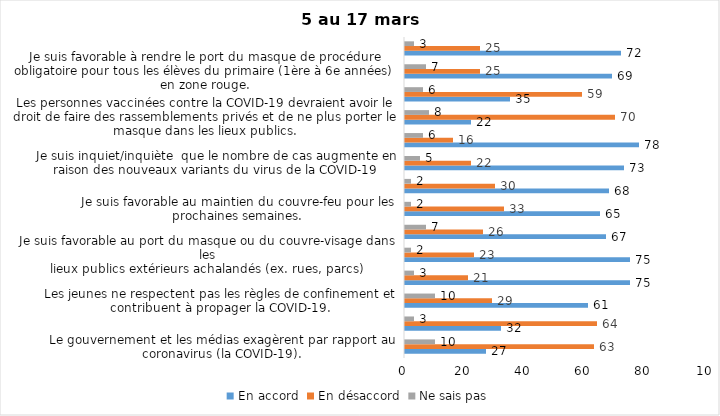
| Category | En accord | En désaccord | Ne sais pas |
|---|---|---|---|
| Le gouvernement et les médias exagèrent par rapport au coronavirus (la COVID-19). | 27 | 63 | 10 |
| Il est exagéré de rester chez soi pour se protéger contre le coronavirus (la COVID-19). | 32 | 64 | 3 |
| Les jeunes ne respectent pas les règles de confinement et contribuent à propager la COVID-19. | 61 | 29 | 10 |
| C’est une bonne chose que les policiers puissent donner facilement des contraventions aux gens qui ne respectent pas les mesures pour prévenir le coronavirus (la COVID-19). | 75 | 21 | 3 |
| Je suis favorable au port du masque ou du couvre-visage dans les
lieux publics extérieurs achalandés (ex. rues, parcs) | 75 | 23 | 2 |
| Les activités extérieures en petits groupes sont sécuritaires pour éviter la propagation de la COVID-19. | 67 | 26 | 7 |
| Je suis favorable au maintien du couvre-feu pour les prochaines semaines. | 65 | 33 | 2 |
| J’ai peur que le système de santé soit débordé par les cas de COVID-19 suite à l’assouplissement des mesures | 68 | 30 | 2 |
| Je suis inquiet/inquiète  que le nombre de cas augmente en raison des nouveaux variants du virus de la COVID-19 | 73 | 22 | 5 |
| La frontière entre le Canada et les États-Unis devrait être fermée au moins jusqu’en septembre 2021 | 78 | 16 | 6 |
| Les personnes vaccinées contre la COVID-19 devraient avoir le droit de faire des rassemblements privés et de ne plus porter le masque dans les lieux publics. | 22 | 70 | 8 |
| Je crois que le gouvernement a implanté trop de mesures par rapport à ce que la santé publique recommandait (ex. : fermeture des restaurants). | 35 | 59 | 6 |
| Je suis favorable à rendre le port du masque de procédure obligatoire pour tous les élèves du primaire (1ère à 6e années) en zone rouge. | 69 | 25 | 7 |
| Pour éviter la propagation de la COVID-19, c’est une bonne chose que le gouvernement maintiennent des mesures préventives plus strictes pour les régions entourant Montréal. | 72 | 25 | 3 |